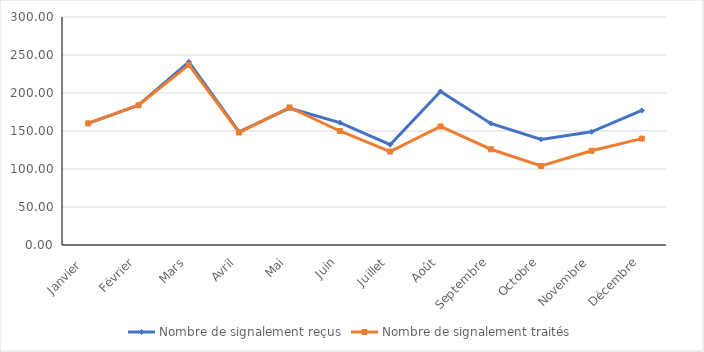
| Category | Nombre de signalement reçus | Nombre de signalement traités |
|---|---|---|
| Janvier  | 160 | 160 |
| Février | 184 | 184 |
| Mars | 241 | 237 |
| Avril | 149 | 148 |
| Mai | 180 | 181 |
| Juin | 161 | 150 |
| Juillet | 132 | 123 |
| Août | 202 | 156 |
| Septembre | 160 | 126 |
| Octobre | 139 | 104 |
| Novembre | 149 | 124 |
| Décembre | 177 | 140 |